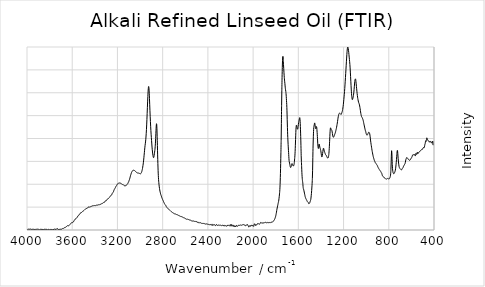
| Category | Series 0 |
|---|---|
| 3996.72717 | 0.007 |
| 3994.66594 | 0.007 |
| 3992.60471 | 0.009 |
| 3990.54348 | 0.011 |
| 3988.48225 | 0.01 |
| 3986.42102 | 0.009 |
| 3984.35979 | 0.008 |
| 3982.29856 | 0.007 |
| 3980.23732 | 0.006 |
| 3978.17609 | 0.008 |
| 3976.11486 | 0.01 |
| 3974.05363 | 0.009 |
| 3971.9924 | 0.008 |
| 3969.93117 | 0.01 |
| 3967.86994 | 0.01 |
| 3965.80871 | 0.009 |
| 3963.74748 | 0.006 |
| 3961.68624 | 0.006 |
| 3959.62501 | 0.007 |
| 3957.56378 | 0.008 |
| 3955.50255 | 0.008 |
| 3953.44132 | 0.008 |
| 3951.38009 | 0.008 |
| 3949.31886 | 0.008 |
| 3947.25763 | 0.008 |
| 3945.1964 | 0.007 |
| 3943.13516 | 0.008 |
| 3941.07393 | 0.008 |
| 3939.0127 | 0.008 |
| 3936.95147 | 0.007 |
| 3934.89024 | 0.007 |
| 3932.82901 | 0.003 |
| 3930.76778 | 0.001 |
| 3928.70655 | 0.003 |
| 3926.64532 | 0.006 |
| 3924.58408 | 0.007 |
| 3922.52285 | 0.006 |
| 3920.46162 | 0.006 |
| 3918.40039 | 0.006 |
| 3916.33916 | 0.007 |
| 3914.27793 | 0.009 |
| 3912.2167 | 0.009 |
| 3910.15547 | 0.008 |
| 3908.09423 | 0.008 |
| 3906.033 | 0.009 |
| 3903.97177 | 0.008 |
| 3901.91054 | 0.006 |
| 3899.84931 | 0.005 |
| 3897.78808 | 0.008 |
| 3895.72685 | 0.008 |
| 3893.66562 | 0.006 |
| 3891.60439 | 0.004 |
| 3889.54315 | 0.003 |
| 3887.48192 | 0.003 |
| 3885.42069 | 0.005 |
| 3883.35946 | 0.007 |
| 3881.29823 | 0.007 |
| 3879.237 | 0.007 |
| 3877.17577 | 0.007 |
| 3875.11454 | 0.007 |
| 3873.05331 | 0.007 |
| 3870.99207 | 0.006 |
| 3868.93084 | 0.006 |
| 3866.86961 | 0.003 |
| 3864.80838 | 0.001 |
| 3862.74715 | 0.004 |
| 3860.68592 | 0.008 |
| 3858.62469 | 0.008 |
| 3856.56346 | 0.005 |
| 3854.50223 | 0.002 |
| 3852.44099 | 0.003 |
| 3850.37976 | 0.006 |
| 3848.31853 | 0.008 |
| 3846.2573 | 0.007 |
| 3844.19607 | 0.007 |
| 3842.13484 | 0.007 |
| 3840.07361 | 0.007 |
| 3838.01238 | 0.007 |
| 3835.95115 | 0.007 |
| 3833.88991 | 0.005 |
| 3831.82868 | 0.004 |
| 3829.76745 | 0.005 |
| 3827.70622 | 0.007 |
| 3825.64499 | 0.007 |
| 3823.58376 | 0.007 |
| 3821.52253 | 0.005 |
| 3819.4613 | 0.002 |
| 3817.40006 | 0 |
| 3815.33883 | 0.002 |
| 3813.2776 | 0.006 |
| 3811.21637 | 0.008 |
| 3809.15514 | 0.007 |
| 3807.09391 | 0.005 |
| 3805.03268 | 0.002 |
| 3802.97145 | 0 |
| 3800.91022 | 0.002 |
| 3798.84898 | 0.003 |
| 3796.78775 | 0.004 |
| 3794.72652 | 0.006 |
| 3792.66529 | 0.006 |
| 3790.60406 | 0.004 |
| 3788.54283 | 0.004 |
| 3786.4816 | 0.006 |
| 3784.42037 | 0.006 |
| 3782.35914 | 0.005 |
| 3780.2979 | 0.004 |
| 3778.23667 | 0.004 |
| 3776.17544 | 0.003 |
| 3774.11421 | 0.003 |
| 3772.05298 | 0.002 |
| 3769.99175 | 0.003 |
| 3767.93052 | 0.006 |
| 3765.86929 | 0.006 |
| 3763.80806 | 0.003 |
| 3761.74682 | 0.003 |
| 3759.68559 | 0.007 |
| 3757.62436 | 0.012 |
| 3755.56313 | 0.012 |
| 3753.5019 | 0.01 |
| 3751.44067 | 0.008 |
| 3749.37944 | 0.008 |
| 3747.31821 | 0.008 |
| 3745.25698 | 0.005 |
| 3743.19574 | 0.007 |
| 3741.13451 | 0.011 |
| 3739.07328 | 0.012 |
| 3737.01205 | 0.011 |
| 3734.95082 | 0.011 |
| 3732.88959 | 0.013 |
| 3730.82836 | 0.015 |
| 3728.76713 | 0.015 |
| 3726.70589 | 0.011 |
| 3724.64466 | 0.005 |
| 3722.58343 | 0.002 |
| 3720.5222 | 0.004 |
| 3718.46097 | 0.005 |
| 3716.39974 | 0.007 |
| 3714.33851 | 0.008 |
| 3712.27728 | 0.006 |
| 3710.21605 | 0.005 |
| 3708.15481 | 0.005 |
| 3706.09358 | 0.006 |
| 3704.03235 | 0.008 |
| 3701.97112 | 0.01 |
| 3699.90989 | 0.01 |
| 3697.84866 | 0.009 |
| 3695.78743 | 0.009 |
| 3693.7262 | 0.01 |
| 3691.66497 | 0.011 |
| 3689.60373 | 0.013 |
| 3687.5425 | 0.015 |
| 3685.48127 | 0.016 |
| 3683.42004 | 0.018 |
| 3681.35881 | 0.02 |
| 3679.29758 | 0.018 |
| 3677.23635 | 0.017 |
| 3675.17512 | 0.02 |
| 3673.11389 | 0.023 |
| 3671.05265 | 0.024 |
| 3668.99142 | 0.025 |
| 3666.93019 | 0.026 |
| 3664.86896 | 0.025 |
| 3662.80773 | 0.026 |
| 3660.7465 | 0.028 |
| 3658.68527 | 0.03 |
| 3656.62404 | 0.032 |
| 3654.56281 | 0.033 |
| 3652.50157 | 0.035 |
| 3650.44034 | 0.038 |
| 3648.37911 | 0.042 |
| 3646.31788 | 0.044 |
| 3644.25665 | 0.046 |
| 3642.19542 | 0.047 |
| 3640.13419 | 0.047 |
| 3638.07296 | 0.045 |
| 3636.01172 | 0.043 |
| 3633.95049 | 0.045 |
| 3631.88926 | 0.047 |
| 3629.82803 | 0.048 |
| 3627.7668 | 0.051 |
| 3625.70557 | 0.054 |
| 3623.64434 | 0.055 |
| 3621.58311 | 0.058 |
| 3619.52188 | 0.06 |
| 3617.46064 | 0.063 |
| 3615.39941 | 0.067 |
| 3613.33818 | 0.07 |
| 3611.27695 | 0.072 |
| 3609.21572 | 0.076 |
| 3607.15449 | 0.079 |
| 3605.09326 | 0.079 |
| 3603.03203 | 0.078 |
| 3600.9708 | 0.077 |
| 3598.90956 | 0.079 |
| 3596.84833 | 0.083 |
| 3594.7871 | 0.087 |
| 3592.72587 | 0.09 |
| 3590.66464 | 0.089 |
| 3588.60341 | 0.089 |
| 3586.54218 | 0.095 |
| 3584.48095 | 0.1 |
| 3582.41972 | 0.104 |
| 3580.35848 | 0.107 |
| 3578.29725 | 0.111 |
| 3576.23602 | 0.116 |
| 3574.17479 | 0.119 |
| 3572.11356 | 0.12 |
| 3570.05233 | 0.12 |
| 3567.9911 | 0.121 |
| 3565.92987 | 0.128 |
| 3563.86864 | 0.13 |
| 3561.8074 | 0.131 |
| 3559.74617 | 0.134 |
| 3557.68494 | 0.137 |
| 3555.62371 | 0.14 |
| 3553.56248 | 0.146 |
| 3551.50125 | 0.152 |
| 3549.44002 | 0.153 |
| 3547.37879 | 0.152 |
| 3545.31755 | 0.155 |
| 3543.25632 | 0.16 |
| 3541.19509 | 0.164 |
| 3539.13386 | 0.168 |
| 3537.07263 | 0.171 |
| 3535.0114 | 0.172 |
| 3532.95017 | 0.173 |
| 3530.88894 | 0.176 |
| 3528.82771 | 0.181 |
| 3526.76647 | 0.187 |
| 3524.70524 | 0.19 |
| 3522.64401 | 0.191 |
| 3520.58278 | 0.192 |
| 3518.52155 | 0.192 |
| 3516.46032 | 0.192 |
| 3514.39909 | 0.194 |
| 3512.33786 | 0.198 |
| 3510.27663 | 0.201 |
| 3508.21539 | 0.204 |
| 3506.15416 | 0.206 |
| 3504.09293 | 0.206 |
| 3502.0317 | 0.208 |
| 3499.97047 | 0.21 |
| 3497.90924 | 0.212 |
| 3495.84801 | 0.214 |
| 3493.78678 | 0.218 |
| 3491.72555 | 0.221 |
| 3489.66431 | 0.223 |
| 3487.60308 | 0.225 |
| 3485.54185 | 0.226 |
| 3483.48062 | 0.226 |
| 3481.41939 | 0.229 |
| 3479.35816 | 0.232 |
| 3477.29693 | 0.235 |
| 3475.2357 | 0.236 |
| 3473.17447 | 0.235 |
| 3471.11323 | 0.236 |
| 3469.052 | 0.24 |
| 3466.99077 | 0.242 |
| 3464.92954 | 0.24 |
| 3462.86831 | 0.241 |
| 3460.80708 | 0.243 |
| 3458.74585 | 0.246 |
| 3456.68462 | 0.249 |
| 3454.62338 | 0.253 |
| 3452.56215 | 0.255 |
| 3450.50092 | 0.253 |
| 3448.43969 | 0.25 |
| 3446.37846 | 0.25 |
| 3444.31723 | 0.252 |
| 3442.256 | 0.255 |
| 3440.19477 | 0.255 |
| 3438.13354 | 0.254 |
| 3436.0723 | 0.255 |
| 3434.01107 | 0.256 |
| 3431.94984 | 0.257 |
| 3429.88861 | 0.258 |
| 3427.82738 | 0.26 |
| 3425.76615 | 0.261 |
| 3423.70492 | 0.262 |
| 3421.64369 | 0.264 |
| 3419.58246 | 0.265 |
| 3417.52122 | 0.262 |
| 3415.45999 | 0.261 |
| 3413.39876 | 0.264 |
| 3411.33753 | 0.266 |
| 3409.2763 | 0.265 |
| 3407.21507 | 0.264 |
| 3405.15384 | 0.266 |
| 3403.09261 | 0.267 |
| 3401.03138 | 0.268 |
| 3398.97014 | 0.268 |
| 3396.90891 | 0.267 |
| 3394.84768 | 0.267 |
| 3392.78645 | 0.267 |
| 3390.72522 | 0.268 |
| 3388.66399 | 0.269 |
| 3386.60276 | 0.27 |
| 3384.54153 | 0.271 |
| 3382.4803 | 0.271 |
| 3380.41906 | 0.27 |
| 3378.35783 | 0.27 |
| 3376.2966 | 0.272 |
| 3374.23537 | 0.274 |
| 3372.17414 | 0.276 |
| 3370.11291 | 0.277 |
| 3368.05168 | 0.276 |
| 3365.99045 | 0.274 |
| 3363.92921 | 0.273 |
| 3361.86798 | 0.273 |
| 3359.80675 | 0.274 |
| 3357.74552 | 0.277 |
| 3355.68429 | 0.279 |
| 3353.62306 | 0.28 |
| 3351.56183 | 0.28 |
| 3349.5006 | 0.281 |
| 3347.43937 | 0.283 |
| 3345.37813 | 0.284 |
| 3343.3169 | 0.284 |
| 3341.25567 | 0.286 |
| 3339.19444 | 0.289 |
| 3337.13321 | 0.29 |
| 3335.07198 | 0.29 |
| 3333.01075 | 0.291 |
| 3330.94952 | 0.293 |
| 3328.88829 | 0.294 |
| 3326.82705 | 0.296 |
| 3324.76582 | 0.298 |
| 3322.70459 | 0.3 |
| 3320.64336 | 0.302 |
| 3318.58213 | 0.302 |
| 3316.5209 | 0.301 |
| 3314.45967 | 0.303 |
| 3312.39844 | 0.307 |
| 3310.33721 | 0.313 |
| 3308.27597 | 0.318 |
| 3306.21474 | 0.319 |
| 3304.15351 | 0.319 |
| 3302.09228 | 0.32 |
| 3300.03105 | 0.32 |
| 3297.96982 | 0.321 |
| 3295.90859 | 0.325 |
| 3293.84736 | 0.33 |
| 3291.78613 | 0.334 |
| 3289.72489 | 0.337 |
| 3287.66366 | 0.339 |
| 3285.60243 | 0.338 |
| 3283.5412 | 0.338 |
| 3281.47997 | 0.341 |
| 3279.41874 | 0.345 |
| 3277.35751 | 0.348 |
| 3275.29628 | 0.351 |
| 3273.23504 | 0.353 |
| 3271.17381 | 0.356 |
| 3269.11258 | 0.36 |
| 3267.05135 | 0.363 |
| 3264.99012 | 0.367 |
| 3262.92889 | 0.372 |
| 3260.86766 | 0.375 |
| 3258.80643 | 0.377 |
| 3256.7452 | 0.378 |
| 3254.68396 | 0.379 |
| 3252.62273 | 0.381 |
| 3250.5615 | 0.385 |
| 3248.50027 | 0.392 |
| 3246.43904 | 0.398 |
| 3244.37781 | 0.403 |
| 3242.31658 | 0.407 |
| 3240.25535 | 0.41 |
| 3238.19412 | 0.411 |
| 3236.13288 | 0.415 |
| 3234.07165 | 0.422 |
| 3232.01042 | 0.431 |
| 3229.94919 | 0.438 |
| 3227.88796 | 0.443 |
| 3225.82673 | 0.447 |
| 3223.7655 | 0.451 |
| 3221.70427 | 0.456 |
| 3219.64304 | 0.461 |
| 3217.5818 | 0.465 |
| 3215.52057 | 0.47 |
| 3213.45934 | 0.476 |
| 3211.39811 | 0.481 |
| 3209.33688 | 0.484 |
| 3207.27565 | 0.486 |
| 3205.21442 | 0.49 |
| 3203.15319 | 0.495 |
| 3201.09196 | 0.5 |
| 3199.03072 | 0.504 |
| 3196.96949 | 0.506 |
| 3194.90826 | 0.509 |
| 3192.84703 | 0.512 |
| 3190.7858 | 0.512 |
| 3188.72457 | 0.511 |
| 3186.66334 | 0.512 |
| 3184.60211 | 0.512 |
| 3182.54087 | 0.513 |
| 3180.47964 | 0.514 |
| 3178.41841 | 0.513 |
| 3176.35718 | 0.513 |
| 3174.29595 | 0.512 |
| 3172.23472 | 0.511 |
| 3170.17349 | 0.51 |
| 3168.11226 | 0.509 |
| 3166.05103 | 0.506 |
| 3163.98979 | 0.504 |
| 3161.92856 | 0.502 |
| 3159.86733 | 0.5 |
| 3157.8061 | 0.499 |
| 3155.74487 | 0.497 |
| 3153.68364 | 0.496 |
| 3151.62241 | 0.497 |
| 3149.56118 | 0.497 |
| 3147.49995 | 0.495 |
| 3145.43871 | 0.493 |
| 3143.37748 | 0.49 |
| 3141.31625 | 0.486 |
| 3139.25502 | 0.485 |
| 3137.19379 | 0.484 |
| 3135.13256 | 0.482 |
| 3133.07133 | 0.481 |
| 3131.0101 | 0.483 |
| 3128.94887 | 0.484 |
| 3126.88763 | 0.483 |
| 3124.8264 | 0.483 |
| 3122.76517 | 0.486 |
| 3120.70394 | 0.489 |
| 3118.64271 | 0.493 |
| 3116.58148 | 0.496 |
| 3114.52025 | 0.499 |
| 3112.45902 | 0.502 |
| 3110.39779 | 0.505 |
| 3108.33655 | 0.509 |
| 3106.27532 | 0.514 |
| 3104.21409 | 0.52 |
| 3102.15286 | 0.524 |
| 3100.09163 | 0.529 |
| 3098.0304 | 0.537 |
| 3095.96917 | 0.545 |
| 3093.90794 | 0.551 |
| 3091.8467 | 0.559 |
| 3089.78547 | 0.568 |
| 3087.72424 | 0.578 |
| 3085.66301 | 0.588 |
| 3083.60178 | 0.597 |
| 3081.54055 | 0.605 |
| 3079.47932 | 0.613 |
| 3077.41809 | 0.621 |
| 3075.35686 | 0.628 |
| 3073.29562 | 0.634 |
| 3071.23439 | 0.638 |
| 3069.17316 | 0.643 |
| 3067.11193 | 0.647 |
| 3065.0507 | 0.65 |
| 3062.98947 | 0.652 |
| 3060.92824 | 0.653 |
| 3058.86701 | 0.653 |
| 3056.80578 | 0.653 |
| 3054.74454 | 0.652 |
| 3052.68331 | 0.652 |
| 3050.62208 | 0.651 |
| 3048.56085 | 0.649 |
| 3046.49962 | 0.648 |
| 3044.43839 | 0.645 |
| 3042.37716 | 0.643 |
| 3040.31593 | 0.641 |
| 3038.2547 | 0.638 |
| 3036.19346 | 0.636 |
| 3034.13223 | 0.632 |
| 3032.071 | 0.629 |
| 3030.00977 | 0.629 |
| 3027.94854 | 0.629 |
| 3025.88731 | 0.627 |
| 3023.82608 | 0.625 |
| 3021.76485 | 0.623 |
| 3019.70362 | 0.62 |
| 3017.64238 | 0.62 |
| 3015.58115 | 0.621 |
| 3013.51992 | 0.622 |
| 3011.45869 | 0.622 |
| 3009.39746 | 0.62 |
| 3007.33623 | 0.619 |
| 3005.275 | 0.618 |
| 3003.21377 | 0.618 |
| 3001.15253 | 0.617 |
| 2999.0913 | 0.615 |
| 2997.03007 | 0.614 |
| 2994.96884 | 0.615 |
| 2992.90761 | 0.617 |
| 2990.84638 | 0.621 |
| 2988.78515 | 0.626 |
| 2986.72392 | 0.631 |
| 2984.66269 | 0.639 |
| 2982.60145 | 0.649 |
| 2980.54022 | 0.659 |
| 2978.47899 | 0.672 |
| 2976.41776 | 0.688 |
| 2974.35653 | 0.705 |
| 2972.2953 | 0.722 |
| 2970.23407 | 0.741 |
| 2968.17284 | 0.764 |
| 2966.11161 | 0.79 |
| 2964.05037 | 0.817 |
| 2961.98914 | 0.845 |
| 2959.92791 | 0.872 |
| 2957.86668 | 0.898 |
| 2955.80545 | 0.922 |
| 2953.74422 | 0.942 |
| 2951.68299 | 0.962 |
| 2949.62176 | 0.986 |
| 2947.56053 | 1.016 |
| 2945.49929 | 1.053 |
| 2943.43806 | 1.097 |
| 2941.37683 | 1.148 |
| 2939.3156 | 1.207 |
| 2937.25437 | 1.271 |
| 2935.19314 | 1.337 |
| 2933.13191 | 1.4 |
| 2931.07068 | 1.458 |
| 2929.00944 | 1.509 |
| 2926.94821 | 1.547 |
| 2924.88698 | 1.567 |
| 2922.82575 | 1.566 |
| 2920.76452 | 1.541 |
| 2918.70329 | 1.495 |
| 2916.64206 | 1.435 |
| 2914.58083 | 1.369 |
| 2912.5196 | 1.303 |
| 2910.45836 | 1.243 |
| 2908.39713 | 1.186 |
| 2906.3359 | 1.134 |
| 2904.27467 | 1.087 |
| 2902.21344 | 1.047 |
| 2900.15221 | 1.011 |
| 2898.09098 | 0.976 |
| 2896.02975 | 0.94 |
| 2893.96852 | 0.906 |
| 2891.90728 | 0.877 |
| 2889.84605 | 0.852 |
| 2887.78482 | 0.831 |
| 2885.72359 | 0.813 |
| 2883.66236 | 0.8 |
| 2881.60113 | 0.791 |
| 2879.5399 | 0.791 |
| 2877.47867 | 0.8 |
| 2875.41744 | 0.815 |
| 2873.3562 | 0.833 |
| 2871.29497 | 0.851 |
| 2869.23374 | 0.871 |
| 2867.17251 | 0.895 |
| 2865.11128 | 0.928 |
| 2863.05005 | 0.972 |
| 2860.98882 | 1.027 |
| 2858.92759 | 1.086 |
| 2856.86636 | 1.135 |
| 2854.80512 | 1.162 |
| 2852.74389 | 1.153 |
| 2850.68266 | 1.106 |
| 2848.62143 | 1.024 |
| 2846.5602 | 0.924 |
| 2844.49897 | 0.821 |
| 2842.43774 | 0.728 |
| 2840.37651 | 0.653 |
| 2838.31527 | 0.595 |
| 2836.25404 | 0.551 |
| 2834.19281 | 0.519 |
| 2832.13158 | 0.494 |
| 2830.07035 | 0.472 |
| 2828.00912 | 0.454 |
| 2825.94789 | 0.438 |
| 2823.88666 | 0.425 |
| 2821.82543 | 0.413 |
| 2819.76419 | 0.402 |
| 2817.70296 | 0.392 |
| 2815.64173 | 0.384 |
| 2813.5805 | 0.377 |
| 2811.51927 | 0.37 |
| 2809.45804 | 0.361 |
| 2807.39681 | 0.354 |
| 2805.33558 | 0.347 |
| 2803.27435 | 0.342 |
| 2801.21311 | 0.335 |
| 2799.15188 | 0.33 |
| 2797.09065 | 0.324 |
| 2795.02942 | 0.319 |
| 2792.96819 | 0.312 |
| 2790.90696 | 0.306 |
| 2788.84573 | 0.301 |
| 2786.7845 | 0.295 |
| 2784.72327 | 0.289 |
| 2782.66203 | 0.285 |
| 2780.6008 | 0.28 |
| 2778.53957 | 0.277 |
| 2776.47834 | 0.274 |
| 2774.41711 | 0.272 |
| 2772.35588 | 0.268 |
| 2770.29465 | 0.263 |
| 2768.23342 | 0.257 |
| 2766.17219 | 0.253 |
| 2764.11095 | 0.25 |
| 2762.04972 | 0.246 |
| 2759.98849 | 0.243 |
| 2757.92726 | 0.24 |
| 2755.86603 | 0.237 |
| 2753.8048 | 0.234 |
| 2751.74357 | 0.231 |
| 2749.68234 | 0.229 |
| 2747.6211 | 0.228 |
| 2745.55987 | 0.226 |
| 2743.49864 | 0.223 |
| 2741.43741 | 0.221 |
| 2739.37618 | 0.218 |
| 2737.31495 | 0.216 |
| 2735.25372 | 0.214 |
| 2733.19249 | 0.213 |
| 2731.13126 | 0.21 |
| 2729.07002 | 0.208 |
| 2727.00879 | 0.205 |
| 2724.94756 | 0.202 |
| 2722.88633 | 0.2 |
| 2720.8251 | 0.198 |
| 2718.76387 | 0.196 |
| 2716.70264 | 0.193 |
| 2714.64141 | 0.192 |
| 2712.58018 | 0.19 |
| 2710.51894 | 0.188 |
| 2708.45771 | 0.186 |
| 2706.39648 | 0.185 |
| 2704.33525 | 0.184 |
| 2702.27402 | 0.183 |
| 2700.21279 | 0.181 |
| 2698.15156 | 0.179 |
| 2696.09033 | 0.178 |
| 2694.0291 | 0.177 |
| 2691.96786 | 0.177 |
| 2689.90663 | 0.177 |
| 2687.8454 | 0.176 |
| 2685.78417 | 0.174 |
| 2683.72294 | 0.172 |
| 2681.66171 | 0.17 |
| 2679.60048 | 0.17 |
| 2677.53925 | 0.169 |
| 2675.47802 | 0.168 |
| 2673.41678 | 0.166 |
| 2671.35555 | 0.166 |
| 2669.29432 | 0.166 |
| 2667.23309 | 0.165 |
| 2665.17186 | 0.163 |
| 2663.11063 | 0.162 |
| 2661.0494 | 0.16 |
| 2658.98817 | 0.159 |
| 2656.92693 | 0.157 |
| 2654.8657 | 0.157 |
| 2652.80447 | 0.155 |
| 2650.74324 | 0.154 |
| 2648.68201 | 0.154 |
| 2646.62078 | 0.154 |
| 2644.55955 | 0.152 |
| 2642.49832 | 0.15 |
| 2640.43709 | 0.147 |
| 2638.37585 | 0.146 |
| 2636.31462 | 0.146 |
| 2634.25339 | 0.146 |
| 2632.19216 | 0.145 |
| 2630.13093 | 0.142 |
| 2628.0697 | 0.141 |
| 2626.00847 | 0.141 |
| 2623.94724 | 0.141 |
| 2621.88601 | 0.14 |
| 2619.82477 | 0.138 |
| 2617.76354 | 0.136 |
| 2615.70231 | 0.135 |
| 2613.64108 | 0.135 |
| 2611.57985 | 0.134 |
| 2609.51862 | 0.133 |
| 2607.45739 | 0.131 |
| 2605.39616 | 0.13 |
| 2603.33493 | 0.128 |
| 2601.27369 | 0.126 |
| 2599.21246 | 0.124 |
| 2597.15123 | 0.124 |
| 2595.09 | 0.124 |
| 2593.02877 | 0.121 |
| 2590.96754 | 0.118 |
| 2588.90631 | 0.117 |
| 2586.84508 | 0.119 |
| 2584.78385 | 0.12 |
| 2582.72261 | 0.12 |
| 2580.66138 | 0.119 |
| 2578.60015 | 0.117 |
| 2576.53892 | 0.114 |
| 2574.47769 | 0.114 |
| 2572.41646 | 0.115 |
| 2570.35523 | 0.114 |
| 2568.294 | 0.111 |
| 2566.23276 | 0.11 |
| 2564.17153 | 0.11 |
| 2562.1103 | 0.11 |
| 2560.04907 | 0.108 |
| 2557.98784 | 0.107 |
| 2555.92661 | 0.107 |
| 2553.86538 | 0.107 |
| 2551.80415 | 0.106 |
| 2549.74292 | 0.103 |
| 2547.68168 | 0.101 |
| 2545.62045 | 0.101 |
| 2543.55922 | 0.101 |
| 2541.49799 | 0.102 |
| 2539.43676 | 0.101 |
| 2537.37553 | 0.099 |
| 2535.3143 | 0.098 |
| 2533.25307 | 0.098 |
| 2531.19184 | 0.099 |
| 2529.1306 | 0.099 |
| 2527.06937 | 0.098 |
| 2525.00814 | 0.098 |
| 2522.94691 | 0.097 |
| 2520.88568 | 0.095 |
| 2518.82445 | 0.094 |
| 2516.76322 | 0.094 |
| 2514.70199 | 0.094 |
| 2512.64076 | 0.093 |
| 2510.57952 | 0.093 |
| 2508.51829 | 0.094 |
| 2506.45706 | 0.094 |
| 2504.39583 | 0.091 |
| 2502.3346 | 0.09 |
| 2500.27337 | 0.092 |
| 2498.21214 | 0.092 |
| 2496.15091 | 0.087 |
| 2494.08968 | 0.083 |
| 2492.02844 | 0.084 |
| 2489.96721 | 0.085 |
| 2487.90598 | 0.084 |
| 2485.84475 | 0.085 |
| 2483.78352 | 0.083 |
| 2481.72229 | 0.079 |
| 2479.66106 | 0.078 |
| 2477.59983 | 0.081 |
| 2475.53859 | 0.081 |
| 2473.47736 | 0.078 |
| 2471.41613 | 0.076 |
| 2469.3549 | 0.077 |
| 2467.29367 | 0.078 |
| 2465.23244 | 0.079 |
| 2463.17121 | 0.079 |
| 2461.10998 | 0.078 |
| 2459.04875 | 0.075 |
| 2456.98751 | 0.073 |
| 2454.92628 | 0.073 |
| 2452.86505 | 0.073 |
| 2450.80382 | 0.072 |
| 2448.74259 | 0.071 |
| 2446.68136 | 0.072 |
| 2444.62013 | 0.073 |
| 2442.5589 | 0.072 |
| 2440.49767 | 0.072 |
| 2438.43643 | 0.072 |
| 2436.3752 | 0.071 |
| 2434.31397 | 0.071 |
| 2432.25274 | 0.071 |
| 2430.19151 | 0.069 |
| 2428.13028 | 0.066 |
| 2426.06905 | 0.064 |
| 2424.00782 | 0.064 |
| 2421.94659 | 0.064 |
| 2419.88535 | 0.065 |
| 2417.82412 | 0.066 |
| 2415.76289 | 0.065 |
| 2413.70166 | 0.064 |
| 2411.64043 | 0.066 |
| 2409.5792 | 0.068 |
| 2407.51797 | 0.068 |
| 2405.45674 | 0.065 |
| 2403.39551 | 0.062 |
| 2401.33427 | 0.062 |
| 2399.27304 | 0.062 |
| 2397.21181 | 0.062 |
| 2395.15058 | 0.061 |
| 2393.08935 | 0.06 |
| 2391.02812 | 0.06 |
| 2388.96689 | 0.06 |
| 2386.90566 | 0.059 |
| 2384.84442 | 0.058 |
| 2382.78319 | 0.057 |
| 2380.72196 | 0.058 |
| 2378.66073 | 0.059 |
| 2376.5995 | 0.06 |
| 2374.53827 | 0.059 |
| 2372.47704 | 0.055 |
| 2370.41581 | 0.052 |
| 2368.35458 | 0.056 |
| 2366.29334 | 0.06 |
| 2364.23211 | 0.058 |
| 2362.17088 | 0.051 |
| 2360.10965 | 0.05 |
| 2358.04842 | 0.057 |
| 2355.98719 | 0.062 |
| 2353.92596 | 0.059 |
| 2351.86473 | 0.056 |
| 2349.8035 | 0.054 |
| 2347.74226 | 0.052 |
| 2345.68103 | 0.05 |
| 2343.6198 | 0.052 |
| 2341.55857 | 0.058 |
| 2339.49734 | 0.058 |
| 2337.43611 | 0.054 |
| 2335.37488 | 0.052 |
| 2333.31365 | 0.05 |
| 2331.25242 | 0.048 |
| 2329.19118 | 0.049 |
| 2327.12995 | 0.055 |
| 2325.06872 | 0.06 |
| 2323.00749 | 0.06 |
| 2320.94626 | 0.057 |
| 2318.88503 | 0.053 |
| 2316.8238 | 0.051 |
| 2314.76257 | 0.05 |
| 2312.70134 | 0.05 |
| 2310.6401 | 0.051 |
| 2308.57887 | 0.053 |
| 2306.51764 | 0.053 |
| 2304.45641 | 0.053 |
| 2302.39518 | 0.053 |
| 2300.33395 | 0.051 |
| 2298.27272 | 0.051 |
| 2296.21149 | 0.054 |
| 2294.15025 | 0.055 |
| 2292.08902 | 0.055 |
| 2290.02779 | 0.053 |
| 2287.96656 | 0.052 |
| 2285.90533 | 0.052 |
| 2283.8441 | 0.052 |
| 2281.78287 | 0.05 |
| 2279.72164 | 0.048 |
| 2277.66041 | 0.048 |
| 2275.59917 | 0.05 |
| 2273.53794 | 0.052 |
| 2271.47671 | 0.051 |
| 2269.41548 | 0.049 |
| 2267.35425 | 0.047 |
| 2265.29302 | 0.044 |
| 2263.23179 | 0.045 |
| 2261.17056 | 0.05 |
| 2259.10933 | 0.05 |
| 2257.04809 | 0.045 |
| 2254.98686 | 0.043 |
| 2252.92563 | 0.047 |
| 2250.8644 | 0.05 |
| 2248.80317 | 0.048 |
| 2246.74194 | 0.048 |
| 2244.68071 | 0.049 |
| 2242.61948 | 0.045 |
| 2240.55825 | 0.042 |
| 2238.49701 | 0.042 |
| 2236.43578 | 0.042 |
| 2234.37455 | 0.043 |
| 2232.31332 | 0.046 |
| 2230.25209 | 0.047 |
| 2228.19086 | 0.044 |
| 2226.12963 | 0.046 |
| 2224.0684 | 0.053 |
| 2222.00717 | 0.055 |
| 2219.94593 | 0.052 |
| 2217.8847 | 0.052 |
| 2215.82347 | 0.051 |
| 2213.76224 | 0.048 |
| 2211.70101 | 0.046 |
| 2209.63978 | 0.046 |
| 2207.57855 | 0.047 |
| 2205.51732 | 0.051 |
| 2203.45608 | 0.056 |
| 2201.39485 | 0.06 |
| 2199.33362 | 0.056 |
| 2197.27239 | 0.046 |
| 2195.21116 | 0.041 |
| 2193.14993 | 0.047 |
| 2191.0887 | 0.057 |
| 2189.02747 | 0.06 |
| 2186.96624 | 0.054 |
| 2184.905 | 0.052 |
| 2182.84377 | 0.055 |
| 2180.78254 | 0.052 |
| 2178.72131 | 0.044 |
| 2176.66008 | 0.038 |
| 2174.59885 | 0.041 |
| 2172.53762 | 0.048 |
| 2170.47639 | 0.052 |
| 2168.41516 | 0.05 |
| 2166.35392 | 0.042 |
| 2164.29269 | 0.036 |
| 2162.23146 | 0.039 |
| 2160.17023 | 0.045 |
| 2158.109 | 0.043 |
| 2156.04777 | 0.039 |
| 2153.98654 | 0.035 |
| 2151.92531 | 0.038 |
| 2149.86408 | 0.046 |
| 2147.80284 | 0.051 |
| 2145.74161 | 0.051 |
| 2143.68038 | 0.045 |
| 2141.61915 | 0.041 |
| 2139.55792 | 0.041 |
| 2137.49669 | 0.042 |
| 2135.43546 | 0.045 |
| 2133.37423 | 0.048 |
| 2131.313 | 0.048 |
| 2129.25176 | 0.05 |
| 2127.19053 | 0.054 |
| 2125.1293 | 0.056 |
| 2123.06807 | 0.055 |
| 2121.00684 | 0.052 |
| 2118.94561 | 0.05 |
| 2116.88438 | 0.051 |
| 2114.82315 | 0.054 |
| 2112.76191 | 0.055 |
| 2110.70068 | 0.054 |
| 2108.63945 | 0.053 |
| 2106.57822 | 0.051 |
| 2104.51699 | 0.051 |
| 2102.45576 | 0.052 |
| 2100.39453 | 0.053 |
| 2098.3333 | 0.054 |
| 2096.27207 | 0.055 |
| 2094.21083 | 0.057 |
| 2092.1496 | 0.057 |
| 2090.08837 | 0.058 |
| 2088.02714 | 0.059 |
| 2085.96591 | 0.059 |
| 2083.90468 | 0.059 |
| 2081.84345 | 0.059 |
| 2079.78222 | 0.06 |
| 2077.72099 | 0.058 |
| 2075.65975 | 0.053 |
| 2073.59852 | 0.049 |
| 2071.53729 | 0.047 |
| 2069.47606 | 0.046 |
| 2067.41483 | 0.048 |
| 2065.3536 | 0.049 |
| 2063.29237 | 0.051 |
| 2061.23114 | 0.056 |
| 2059.16991 | 0.057 |
| 2057.10867 | 0.053 |
| 2055.04744 | 0.052 |
| 2052.98621 | 0.055 |
| 2050.92498 | 0.058 |
| 2048.86375 | 0.059 |
| 2046.80252 | 0.054 |
| 2044.74129 | 0.048 |
| 2042.68006 | 0.045 |
| 2040.61883 | 0.038 |
| 2038.55759 | 0.031 |
| 2036.49636 | 0.034 |
| 2034.43513 | 0.039 |
| 2032.3739 | 0.041 |
| 2030.31267 | 0.044 |
| 2028.25144 | 0.049 |
| 2026.19021 | 0.049 |
| 2024.12898 | 0.044 |
| 2022.06774 | 0.04 |
| 2020.00651 | 0.044 |
| 2017.94528 | 0.05 |
| 2015.88405 | 0.05 |
| 2013.82282 | 0.052 |
| 2011.76159 | 0.052 |
| 2009.70036 | 0.047 |
| 2007.63913 | 0.044 |
| 2005.5779 | 0.049 |
| 2003.51666 | 0.051 |
| 2001.45543 | 0.048 |
| 1999.3942 | 0.047 |
| 1997.33297 | 0.043 |
| 1995.27174 | 0.039 |
| 1993.21051 | 0.045 |
| 1991.14928 | 0.06 |
| 1989.08805 | 0.068 |
| 1987.02682 | 0.065 |
| 1984.96558 | 0.06 |
| 1982.90435 | 0.06 |
| 1980.84312 | 0.061 |
| 1978.78189 | 0.057 |
| 1976.72066 | 0.049 |
| 1974.65943 | 0.049 |
| 1972.5982 | 0.054 |
| 1970.53697 | 0.057 |
| 1968.47574 | 0.06 |
| 1966.4145 | 0.06 |
| 1964.35327 | 0.061 |
| 1962.29204 | 0.066 |
| 1960.23081 | 0.07 |
| 1958.16958 | 0.071 |
| 1956.10835 | 0.072 |
| 1954.04712 | 0.07 |
| 1951.98589 | 0.067 |
| 1949.92466 | 0.066 |
| 1947.86342 | 0.063 |
| 1945.80219 | 0.063 |
| 1943.74096 | 0.064 |
| 1941.67973 | 0.065 |
| 1939.6185 | 0.068 |
| 1937.55727 | 0.072 |
| 1935.49604 | 0.078 |
| 1933.43481 | 0.083 |
| 1931.37357 | 0.082 |
| 1929.31234 | 0.079 |
| 1927.25111 | 0.079 |
| 1925.18988 | 0.078 |
| 1923.12865 | 0.076 |
| 1921.06742 | 0.074 |
| 1919.00619 | 0.073 |
| 1916.94496 | 0.077 |
| 1914.88373 | 0.08 |
| 1912.82249 | 0.079 |
| 1910.76126 | 0.077 |
| 1908.70003 | 0.076 |
| 1906.6388 | 0.077 |
| 1904.57757 | 0.08 |
| 1902.51634 | 0.081 |
| 1900.45511 | 0.078 |
| 1898.39388 | 0.078 |
| 1896.33265 | 0.081 |
| 1894.27141 | 0.082 |
| 1892.21018 | 0.083 |
| 1890.14895 | 0.084 |
| 1888.08772 | 0.083 |
| 1886.02649 | 0.081 |
| 1883.96526 | 0.081 |
| 1881.90403 | 0.08 |
| 1879.8428 | 0.079 |
| 1877.78157 | 0.081 |
| 1875.72033 | 0.084 |
| 1873.6591 | 0.082 |
| 1871.59787 | 0.079 |
| 1869.53664 | 0.078 |
| 1867.47541 | 0.081 |
| 1865.41418 | 0.081 |
| 1863.35295 | 0.079 |
| 1861.29172 | 0.079 |
| 1859.23049 | 0.079 |
| 1857.16925 | 0.08 |
| 1855.10802 | 0.081 |
| 1853.04679 | 0.083 |
| 1850.98556 | 0.083 |
| 1848.92433 | 0.08 |
| 1846.8631 | 0.078 |
| 1844.80187 | 0.081 |
| 1842.74064 | 0.084 |
| 1840.6794 | 0.085 |
| 1838.61817 | 0.085 |
| 1836.55694 | 0.086 |
| 1834.49571 | 0.086 |
| 1832.43448 | 0.085 |
| 1830.37325 | 0.085 |
| 1828.31202 | 0.089 |
| 1826.25079 | 0.092 |
| 1824.18956 | 0.095 |
| 1822.12832 | 0.096 |
| 1820.06709 | 0.098 |
| 1818.00586 | 0.1 |
| 1815.94463 | 0.102 |
| 1813.8834 | 0.106 |
| 1811.82217 | 0.112 |
| 1809.76094 | 0.118 |
| 1807.69971 | 0.123 |
| 1805.63848 | 0.13 |
| 1803.57724 | 0.137 |
| 1801.51601 | 0.145 |
| 1799.45478 | 0.156 |
| 1797.39355 | 0.168 |
| 1795.33232 | 0.181 |
| 1793.27109 | 0.195 |
| 1791.20986 | 0.213 |
| 1789.14863 | 0.227 |
| 1787.0874 | 0.24 |
| 1785.02616 | 0.253 |
| 1782.96493 | 0.265 |
| 1780.9037 | 0.277 |
| 1778.84247 | 0.29 |
| 1776.78124 | 0.301 |
| 1774.72001 | 0.312 |
| 1772.65878 | 0.328 |
| 1770.59755 | 0.347 |
| 1768.53632 | 0.369 |
| 1766.47508 | 0.394 |
| 1764.41385 | 0.424 |
| 1762.35262 | 0.469 |
| 1760.29139 | 0.535 |
| 1758.23016 | 0.618 |
| 1756.16893 | 0.727 |
| 1754.1077 | 0.844 |
| 1752.04647 | 0.978 |
| 1749.98523 | 1.164 |
| 1747.924 | 1.363 |
| 1745.86277 | 1.528 |
| 1743.80154 | 1.667 |
| 1741.74031 | 1.777 |
| 1739.67908 | 1.855 |
| 1737.61785 | 1.895 |
| 1735.55662 | 1.898 |
| 1733.49539 | 1.861 |
| 1731.43415 | 1.811 |
| 1729.37292 | 1.768 |
| 1727.31169 | 1.724 |
| 1725.25046 | 1.686 |
| 1723.18923 | 1.652 |
| 1721.128 | 1.626 |
| 1719.06677 | 1.603 |
| 1717.00554 | 1.574 |
| 1714.94431 | 1.549 |
| 1712.88307 | 1.532 |
| 1710.82184 | 1.513 |
| 1708.76061 | 1.49 |
| 1706.69938 | 1.457 |
| 1704.63815 | 1.414 |
| 1702.57692 | 1.37 |
| 1700.51569 | 1.303 |
| 1698.45446 | 1.21 |
| 1696.39323 | 1.122 |
| 1694.33199 | 1.04 |
| 1692.27076 | 0.984 |
| 1690.20953 | 0.933 |
| 1688.1483 | 0.885 |
| 1686.08707 | 0.848 |
| 1684.02584 | 0.801 |
| 1681.96461 | 0.762 |
| 1679.90338 | 0.743 |
| 1677.84215 | 0.731 |
| 1675.78091 | 0.719 |
| 1673.71968 | 0.705 |
| 1671.65845 | 0.692 |
| 1669.59722 | 0.684 |
| 1667.53599 | 0.683 |
| 1665.47476 | 0.686 |
| 1663.41353 | 0.694 |
| 1661.3523 | 0.705 |
| 1659.29106 | 0.717 |
| 1657.22983 | 0.724 |
| 1655.1686 | 0.727 |
| 1653.10737 | 0.722 |
| 1651.04614 | 0.717 |
| 1648.98491 | 0.71 |
| 1646.92368 | 0.702 |
| 1644.86245 | 0.699 |
| 1642.80122 | 0.7 |
| 1640.73998 | 0.705 |
| 1638.67875 | 0.712 |
| 1636.61752 | 0.725 |
| 1634.55629 | 0.752 |
| 1632.49506 | 0.779 |
| 1630.43383 | 0.81 |
| 1628.3726 | 0.859 |
| 1626.31137 | 0.921 |
| 1624.25014 | 0.99 |
| 1622.1889 | 1.066 |
| 1620.12767 | 1.117 |
| 1618.06644 | 1.141 |
| 1616.00521 | 1.145 |
| 1613.94398 | 1.135 |
| 1611.88275 | 1.121 |
| 1609.82152 | 1.109 |
| 1607.76029 | 1.102 |
| 1605.69906 | 1.102 |
| 1603.63782 | 1.113 |
| 1601.57659 | 1.132 |
| 1599.51536 | 1.154 |
| 1597.45413 | 1.173 |
| 1595.3929 | 1.188 |
| 1593.33167 | 1.2 |
| 1591.27044 | 1.213 |
| 1589.20921 | 1.225 |
| 1587.14798 | 1.227 |
| 1585.08674 | 1.208 |
| 1583.02551 | 1.162 |
| 1580.96428 | 1.095 |
| 1578.90305 | 1.02 |
| 1576.84182 | 0.922 |
| 1574.78059 | 0.813 |
| 1572.71936 | 0.745 |
| 1570.65813 | 0.69 |
| 1568.59689 | 0.627 |
| 1566.53566 | 0.583 |
| 1564.47443 | 0.552 |
| 1562.4132 | 0.531 |
| 1560.35197 | 0.512 |
| 1558.29074 | 0.477 |
| 1556.22951 | 0.456 |
| 1554.16828 | 0.448 |
| 1552.10705 | 0.439 |
| 1550.04581 | 0.428 |
| 1547.98458 | 0.415 |
| 1545.92335 | 0.403 |
| 1543.86212 | 0.391 |
| 1541.80089 | 0.378 |
| 1539.73966 | 0.366 |
| 1537.67843 | 0.356 |
| 1535.6172 | 0.35 |
| 1533.55597 | 0.343 |
| 1531.49473 | 0.338 |
| 1529.4335 | 0.334 |
| 1527.37227 | 0.329 |
| 1525.31104 | 0.324 |
| 1523.24981 | 0.319 |
| 1521.18858 | 0.313 |
| 1519.12735 | 0.309 |
| 1517.06612 | 0.305 |
| 1515.00489 | 0.302 |
| 1512.94365 | 0.301 |
| 1510.88242 | 0.299 |
| 1508.82119 | 0.294 |
| 1506.75996 | 0.287 |
| 1504.69873 | 0.288 |
| 1502.6375 | 0.292 |
| 1500.57627 | 0.295 |
| 1498.51504 | 0.299 |
| 1496.45381 | 0.307 |
| 1494.39257 | 0.316 |
| 1492.33134 | 0.322 |
| 1490.27011 | 0.331 |
| 1488.20888 | 0.35 |
| 1486.14765 | 0.374 |
| 1484.08642 | 0.4 |
| 1482.02519 | 0.432 |
| 1479.96396 | 0.47 |
| 1477.90272 | 0.511 |
| 1475.84149 | 0.564 |
| 1473.78026 | 0.653 |
| 1471.71903 | 0.794 |
| 1469.6578 | 0.918 |
| 1467.59657 | 1.006 |
| 1465.53534 | 1.076 |
| 1463.47411 | 1.119 |
| 1461.41288 | 1.137 |
| 1459.35164 | 1.149 |
| 1457.29041 | 1.165 |
| 1455.22918 | 1.17 |
| 1453.16795 | 1.158 |
| 1451.10672 | 1.138 |
| 1449.04549 | 1.12 |
| 1446.98426 | 1.107 |
| 1444.92303 | 1.108 |
| 1442.8618 | 1.118 |
| 1440.80056 | 1.128 |
| 1438.73933 | 1.13 |
| 1436.6781 | 1.114 |
| 1434.61687 | 1.082 |
| 1432.55564 | 1.045 |
| 1430.49441 | 0.998 |
| 1428.43318 | 0.949 |
| 1426.37195 | 0.914 |
| 1424.31072 | 0.894 |
| 1422.24948 | 0.891 |
| 1420.18825 | 0.904 |
| 1418.12702 | 0.928 |
| 1416.06579 | 0.94 |
| 1414.00456 | 0.934 |
| 1411.94333 | 0.92 |
| 1409.8821 | 0.906 |
| 1407.82087 | 0.896 |
| 1405.75964 | 0.888 |
| 1403.6984 | 0.879 |
| 1401.63717 | 0.868 |
| 1399.57594 | 0.853 |
| 1397.51471 | 0.833 |
| 1395.45348 | 0.813 |
| 1393.39225 | 0.8 |
| 1391.33102 | 0.798 |
| 1389.26979 | 0.804 |
| 1387.20855 | 0.818 |
| 1385.14732 | 0.837 |
| 1383.08609 | 0.857 |
| 1381.02486 | 0.876 |
| 1378.96363 | 0.891 |
| 1376.9024 | 0.894 |
| 1374.84117 | 0.886 |
| 1372.77994 | 0.874 |
| 1370.71871 | 0.863 |
| 1368.65747 | 0.855 |
| 1366.59624 | 0.848 |
| 1364.53501 | 0.842 |
| 1362.47378 | 0.835 |
| 1360.41255 | 0.827 |
| 1358.35132 | 0.822 |
| 1356.29009 | 0.82 |
| 1354.22886 | 0.818 |
| 1352.16763 | 0.814 |
| 1350.10639 | 0.808 |
| 1348.04516 | 0.802 |
| 1345.98393 | 0.796 |
| 1343.9227 | 0.791 |
| 1341.86147 | 0.788 |
| 1339.80024 | 0.785 |
| 1337.73901 | 0.786 |
| 1335.67778 | 0.79 |
| 1333.61655 | 0.798 |
| 1331.55531 | 0.814 |
| 1329.49408 | 0.838 |
| 1327.43285 | 0.872 |
| 1325.37162 | 0.916 |
| 1323.31039 | 0.969 |
| 1321.24916 | 1.024 |
| 1319.18793 | 1.073 |
| 1317.1267 | 1.106 |
| 1315.06547 | 1.117 |
| 1313.00423 | 1.113 |
| 1310.943 | 1.105 |
| 1308.88177 | 1.099 |
| 1306.82054 | 1.096 |
| 1304.75931 | 1.092 |
| 1302.69808 | 1.084 |
| 1300.63685 | 1.071 |
| 1298.57562 | 1.054 |
| 1296.51438 | 1.038 |
| 1294.45315 | 1.025 |
| 1292.39192 | 1.016 |
| 1290.33069 | 1.013 |
| 1288.26946 | 1.015 |
| 1286.20823 | 1.019 |
| 1284.147 | 1.024 |
| 1282.08577 | 1.031 |
| 1280.02454 | 1.039 |
| 1277.9633 | 1.046 |
| 1275.90207 | 1.053 |
| 1273.84084 | 1.06 |
| 1271.77961 | 1.068 |
| 1269.71838 | 1.078 |
| 1267.65715 | 1.089 |
| 1265.59592 | 1.1 |
| 1263.53469 | 1.11 |
| 1261.47346 | 1.123 |
| 1259.41222 | 1.138 |
| 1257.35099 | 1.153 |
| 1255.28976 | 1.169 |
| 1253.22853 | 1.186 |
| 1251.1673 | 1.204 |
| 1249.10607 | 1.222 |
| 1247.04484 | 1.237 |
| 1244.98361 | 1.25 |
| 1242.92238 | 1.261 |
| 1240.86114 | 1.269 |
| 1238.79991 | 1.274 |
| 1236.73868 | 1.276 |
| 1234.67745 | 1.276 |
| 1232.61622 | 1.275 |
| 1230.55499 | 1.273 |
| 1228.49376 | 1.271 |
| 1226.43253 | 1.268 |
| 1224.3713 | 1.264 |
| 1222.31006 | 1.263 |
| 1220.24883 | 1.265 |
| 1218.1876 | 1.27 |
| 1216.12637 | 1.278 |
| 1214.06514 | 1.286 |
| 1212.00391 | 1.293 |
| 1209.94268 | 1.304 |
| 1207.88145 | 1.318 |
| 1205.82021 | 1.334 |
| 1203.75898 | 1.352 |
| 1201.69775 | 1.373 |
| 1199.63652 | 1.399 |
| 1197.57529 | 1.428 |
| 1195.51406 | 1.455 |
| 1193.45283 | 1.483 |
| 1191.3916 | 1.513 |
| 1189.33037 | 1.547 |
| 1187.26913 | 1.585 |
| 1185.2079 | 1.626 |
| 1183.14667 | 1.666 |
| 1181.08544 | 1.708 |
| 1179.02421 | 1.751 |
| 1176.96298 | 1.795 |
| 1174.90175 | 1.838 |
| 1172.84052 | 1.879 |
| 1170.77929 | 1.917 |
| 1168.71805 | 1.952 |
| 1166.65682 | 1.979 |
| 1164.59559 | 1.995 |
| 1162.53436 | 2 |
| 1160.47313 | 1.996 |
| 1158.4119 | 1.983 |
| 1156.35067 | 1.964 |
| 1154.28944 | 1.941 |
| 1152.22821 | 1.916 |
| 1150.16697 | 1.89 |
| 1148.10574 | 1.864 |
| 1146.04451 | 1.839 |
| 1143.98328 | 1.809 |
| 1141.92205 | 1.771 |
| 1139.86082 | 1.726 |
| 1137.79959 | 1.676 |
| 1135.73836 | 1.626 |
| 1133.67713 | 1.577 |
| 1131.61589 | 1.531 |
| 1129.55466 | 1.491 |
| 1127.49343 | 1.459 |
| 1125.4322 | 1.437 |
| 1123.37097 | 1.426 |
| 1121.30974 | 1.424 |
| 1119.24851 | 1.431 |
| 1117.18728 | 1.442 |
| 1115.12604 | 1.455 |
| 1113.06481 | 1.468 |
| 1111.00358 | 1.486 |
| 1108.94235 | 1.507 |
| 1106.88112 | 1.534 |
| 1104.81989 | 1.565 |
| 1102.75866 | 1.596 |
| 1100.69743 | 1.621 |
| 1098.6362 | 1.639 |
| 1096.57496 | 1.65 |
| 1094.51373 | 1.652 |
| 1092.4525 | 1.643 |
| 1090.39127 | 1.624 |
| 1088.33004 | 1.598 |
| 1086.26881 | 1.57 |
| 1084.20758 | 1.543 |
| 1082.14635 | 1.518 |
| 1080.08512 | 1.493 |
| 1078.02388 | 1.471 |
| 1075.96265 | 1.452 |
| 1073.90142 | 1.437 |
| 1071.84019 | 1.423 |
| 1069.77896 | 1.41 |
| 1067.71773 | 1.399 |
| 1065.6565 | 1.39 |
| 1063.59527 | 1.384 |
| 1061.53404 | 1.377 |
| 1059.4728 | 1.367 |
| 1057.41157 | 1.355 |
| 1055.35034 | 1.34 |
| 1053.28911 | 1.324 |
| 1051.22788 | 1.307 |
| 1049.16665 | 1.29 |
| 1047.10542 | 1.274 |
| 1045.04419 | 1.26 |
| 1042.98296 | 1.249 |
| 1040.92172 | 1.24 |
| 1038.86049 | 1.234 |
| 1036.79926 | 1.231 |
| 1034.73803 | 1.227 |
| 1032.6768 | 1.221 |
| 1030.61557 | 1.214 |
| 1028.55434 | 1.207 |
| 1026.49311 | 1.199 |
| 1024.43187 | 1.187 |
| 1022.37064 | 1.174 |
| 1020.30941 | 1.161 |
| 1018.24818 | 1.149 |
| 1016.18695 | 1.137 |
| 1014.12572 | 1.125 |
| 1012.06449 | 1.113 |
| 1010.00326 | 1.101 |
| 1007.94203 | 1.09 |
| 1005.88079 | 1.083 |
| 1003.81956 | 1.075 |
| 1001.75833 | 1.064 |
| 999.6971 | 1.053 |
| 997.63587 | 1.045 |
| 995.57464 | 1.04 |
| 993.51341 | 1.037 |
| 991.45218 | 1.036 |
| 989.39095 | 1.04 |
| 987.32971 | 1.044 |
| 985.26848 | 1.048 |
| 983.20725 | 1.055 |
| 981.14602 | 1.062 |
| 979.08479 | 1.067 |
| 977.02356 | 1.069 |
| 974.96233 | 1.069 |
| 972.9011 | 1.066 |
| 970.83987 | 1.061 |
| 968.77863 | 1.052 |
| 966.7174 | 1.038 |
| 964.65617 | 1.018 |
| 962.59494 | 0.995 |
| 960.53371 | 0.973 |
| 958.47248 | 0.954 |
| 956.41125 | 0.937 |
| 954.35002 | 0.921 |
| 952.28879 | 0.905 |
| 950.22755 | 0.888 |
| 948.16632 | 0.872 |
| 946.10509 | 0.857 |
| 944.04386 | 0.843 |
| 941.98263 | 0.83 |
| 939.9214 | 0.817 |
| 937.86017 | 0.805 |
| 935.79894 | 0.794 |
| 933.7377 | 0.786 |
| 931.67647 | 0.777 |
| 929.61524 | 0.769 |
| 927.55401 | 0.761 |
| 925.49278 | 0.755 |
| 923.43155 | 0.749 |
| 921.37032 | 0.743 |
| 919.30909 | 0.737 |
| 917.24786 | 0.733 |
| 915.18662 | 0.73 |
| 913.12539 | 0.726 |
| 911.06416 | 0.722 |
| 909.00293 | 0.719 |
| 906.9417 | 0.715 |
| 904.88047 | 0.712 |
| 902.81924 | 0.708 |
| 900.75801 | 0.703 |
| 898.69678 | 0.696 |
| 896.63554 | 0.689 |
| 894.57431 | 0.685 |
| 892.51308 | 0.68 |
| 890.45185 | 0.675 |
| 888.39062 | 0.67 |
| 886.32939 | 0.665 |
| 884.26816 | 0.661 |
| 882.20693 | 0.659 |
| 880.1457 | 0.656 |
| 878.08446 | 0.652 |
| 876.02323 | 0.648 |
| 873.962 | 0.645 |
| 871.90077 | 0.641 |
| 869.83954 | 0.636 |
| 867.77831 | 0.631 |
| 865.71708 | 0.626 |
| 863.65585 | 0.623 |
| 861.59462 | 0.617 |
| 859.53338 | 0.608 |
| 857.47215 | 0.599 |
| 855.41092 | 0.592 |
| 853.34969 | 0.587 |
| 851.28846 | 0.586 |
| 849.22723 | 0.584 |
| 847.166 | 0.582 |
| 845.10477 | 0.58 |
| 843.04353 | 0.578 |
| 840.9823 | 0.573 |
| 838.92107 | 0.568 |
| 836.85984 | 0.566 |
| 834.79861 | 0.566 |
| 832.73738 | 0.565 |
| 830.67615 | 0.562 |
| 828.61492 | 0.56 |
| 826.55369 | 0.56 |
| 824.49245 | 0.559 |
| 822.43122 | 0.557 |
| 820.36999 | 0.557 |
| 818.30876 | 0.559 |
| 816.24753 | 0.56 |
| 814.1863 | 0.562 |
| 812.12507 | 0.563 |
| 810.06384 | 0.563 |
| 808.00261 | 0.563 |
| 805.94137 | 0.562 |
| 803.88014 | 0.56 |
| 801.81891 | 0.559 |
| 799.75768 | 0.56 |
| 797.69645 | 0.561 |
| 795.63522 | 0.561 |
| 793.57399 | 0.562 |
| 791.51276 | 0.567 |
| 789.45153 | 0.574 |
| 787.39029 | 0.581 |
| 785.32906 | 0.592 |
| 783.26783 | 0.614 |
| 781.2066 | 0.659 |
| 779.14537 | 0.733 |
| 777.08414 | 0.819 |
| 775.02291 | 0.867 |
| 772.96168 | 0.845 |
| 770.90045 | 0.779 |
| 768.83921 | 0.714 |
| 766.77798 | 0.67 |
| 764.71675 | 0.646 |
| 762.65552 | 0.632 |
| 760.59429 | 0.623 |
| 758.53306 | 0.617 |
| 756.47183 | 0.615 |
| 754.4106 | 0.615 |
| 752.34936 | 0.617 |
| 750.28813 | 0.622 |
| 748.2269 | 0.629 |
| 746.16567 | 0.635 |
| 744.10444 | 0.643 |
| 742.04321 | 0.654 |
| 739.98198 | 0.669 |
| 737.92075 | 0.688 |
| 735.85952 | 0.712 |
| 733.79828 | 0.739 |
| 731.73705 | 0.771 |
| 729.67582 | 0.806 |
| 727.61459 | 0.838 |
| 725.55336 | 0.863 |
| 723.49213 | 0.87 |
| 721.4309 | 0.853 |
| 719.36967 | 0.819 |
| 717.30844 | 0.783 |
| 715.2472 | 0.754 |
| 713.18597 | 0.732 |
| 711.12474 | 0.712 |
| 709.06351 | 0.695 |
| 707.00228 | 0.685 |
| 704.94105 | 0.679 |
| 702.87982 | 0.675 |
| 700.81859 | 0.671 |
| 698.75736 | 0.668 |
| 696.69612 | 0.666 |
| 694.63489 | 0.662 |
| 692.57366 | 0.659 |
| 690.51243 | 0.657 |
| 688.4512 | 0.657 |
| 686.38997 | 0.658 |
| 684.32874 | 0.662 |
| 682.26751 | 0.667 |
| 680.20628 | 0.671 |
| 678.14504 | 0.676 |
| 676.08381 | 0.679 |
| 674.02258 | 0.682 |
| 671.96135 | 0.688 |
| 669.90012 | 0.696 |
| 667.83889 | 0.703 |
| 665.77766 | 0.704 |
| 663.71643 | 0.706 |
| 661.65519 | 0.712 |
| 659.59396 | 0.718 |
| 657.53273 | 0.722 |
| 655.4715 | 0.728 |
| 653.41027 | 0.74 |
| 651.34904 | 0.754 |
| 649.28781 | 0.767 |
| 647.22658 | 0.776 |
| 645.16535 | 0.782 |
| 643.10411 | 0.788 |
| 641.04288 | 0.792 |
| 638.98165 | 0.792 |
| 636.92042 | 0.789 |
| 634.85919 | 0.786 |
| 632.79796 | 0.782 |
| 630.73673 | 0.777 |
| 628.6755 | 0.773 |
| 626.61427 | 0.771 |
| 624.55303 | 0.77 |
| 622.4918 | 0.768 |
| 620.43057 | 0.765 |
| 618.36934 | 0.764 |
| 616.30811 | 0.762 |
| 614.24688 | 0.762 |
| 612.18565 | 0.763 |
| 610.12442 | 0.765 |
| 608.06319 | 0.771 |
| 606.00195 | 0.776 |
| 603.94072 | 0.78 |
| 601.87949 | 0.786 |
| 599.81826 | 0.789 |
| 597.75703 | 0.791 |
| 595.6958 | 0.796 |
| 593.63457 | 0.803 |
| 591.57334 | 0.811 |
| 589.51211 | 0.82 |
| 587.45087 | 0.821 |
| 585.38964 | 0.818 |
| 583.32841 | 0.821 |
| 581.26718 | 0.824 |
| 579.20595 | 0.824 |
| 577.14472 | 0.824 |
| 575.08349 | 0.824 |
| 573.02226 | 0.824 |
| 570.96102 | 0.824 |
| 568.89979 | 0.818 |
| 566.83856 | 0.81 |
| 564.77733 | 0.811 |
| 562.7161 | 0.823 |
| 560.65487 | 0.835 |
| 558.59364 | 0.837 |
| 556.53241 | 0.832 |
| 554.47118 | 0.826 |
| 552.40994 | 0.827 |
| 550.34871 | 0.837 |
| 548.28748 | 0.849 |
| 546.22625 | 0.849 |
| 544.16502 | 0.838 |
| 542.10379 | 0.834 |
| 540.04256 | 0.84 |
| 537.98133 | 0.846 |
| 535.9201 | 0.847 |
| 533.85886 | 0.85 |
| 531.79763 | 0.852 |
| 529.7364 | 0.851 |
| 527.67517 | 0.856 |
| 525.61394 | 0.861 |
| 523.55271 | 0.863 |
| 521.49148 | 0.864 |
| 519.43025 | 0.867 |
| 517.36902 | 0.871 |
| 515.30778 | 0.873 |
| 513.24655 | 0.875 |
| 511.18532 | 0.875 |
| 509.12409 | 0.878 |
| 507.06286 | 0.883 |
| 505.00163 | 0.883 |
| 502.9404 | 0.882 |
| 500.87917 | 0.886 |
| 498.81794 | 0.892 |
| 496.7567 | 0.892 |
| 494.69547 | 0.895 |
| 492.63424 | 0.903 |
| 490.57301 | 0.906 |
| 488.51178 | 0.902 |
| 486.45055 | 0.901 |
| 484.38932 | 0.909 |
| 482.32809 | 0.925 |
| 480.26685 | 0.937 |
| 478.20562 | 0.944 |
| 476.14439 | 0.961 |
| 474.08316 | 0.975 |
| 472.02193 | 0.971 |
| 469.9607 | 0.967 |
| 467.89947 | 0.977 |
| 465.83824 | 0.996 |
| 463.77701 | 1.007 |
| 461.71577 | 1.003 |
| 459.65454 | 0.997 |
| 457.59331 | 0.99 |
| 455.53208 | 0.984 |
| 453.47085 | 0.98 |
| 451.40962 | 0.975 |
| 449.34839 | 0.973 |
| 447.28716 | 0.971 |
| 445.22593 | 0.97 |
| 443.16469 | 0.965 |
| 441.10346 | 0.959 |
| 439.04223 | 0.965 |
| 436.981 | 0.969 |
| 434.91977 | 0.965 |
| 432.85854 | 0.966 |
| 430.79731 | 0.968 |
| 428.73608 | 0.965 |
| 426.67485 | 0.959 |
| 424.61361 | 0.952 |
| 422.55238 | 0.95 |
| 420.49115 | 0.954 |
| 418.42992 | 0.953 |
| 416.36869 | 0.962 |
| 414.30746 | 0.972 |
| 412.24623 | 0.959 |
| 410.185 | 0.936 |
| 408.12377 | 0.928 |
| 406.06253 | 0.928 |
| 404.0013 | 0.933 |
| 401.94007 | 0.947 |
| 399.87884 | 0.972 |